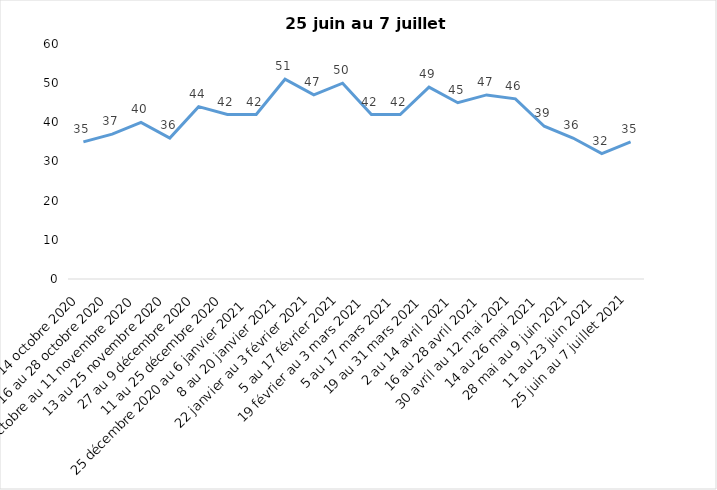
| Category | Toujours aux trois mesures |
|---|---|
| 2 au 14 octobre 2020 | 35 |
| 16 au 28 octobre 2020 | 37 |
| 30 octobre au 11 novembre 2020 | 40 |
| 13 au 25 novembre 2020 | 36 |
| 27 au 9 décembre 2020 | 44 |
| 11 au 25 décembre 2020 | 42 |
| 25 décembre 2020 au 6 janvier 2021 | 42 |
| 8 au 20 janvier 2021 | 51 |
| 22 janvier au 3 février 2021 | 47 |
| 5 au 17 février 2021 | 50 |
| 19 février au 3 mars 2021 | 42 |
| 5 au 17 mars 2021 | 42 |
| 19 au 31 mars 2021 | 49 |
| 2 au 14 avril 2021 | 45 |
| 16 au 28 avril 2021 | 47 |
| 30 avril au 12 mai 2021 | 46 |
| 14 au 26 mai 2021 | 39 |
| 28 mai au 9 juin 2021 | 36 |
| 11 au 23 juin 2021 | 32 |
| 25 juin au 7 juillet 2021 | 35 |